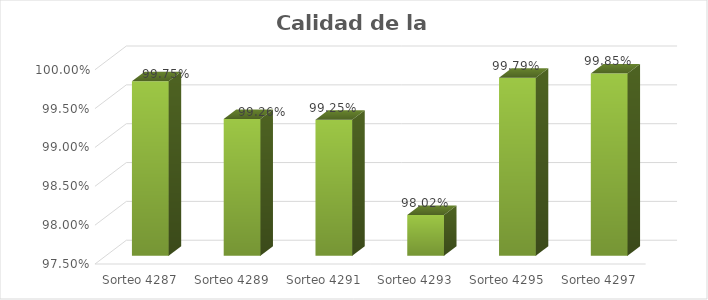
| Category | Series 0 |
|---|---|
| Sorteo 4287 | 0.997 |
| Sorteo 4289 | 0.993 |
| Sorteo 4291 | 0.992 |
| Sorteo 4293 | 0.98 |
| Sorteo 4295 | 0.998 |
| Sorteo 4297 | 0.998 |